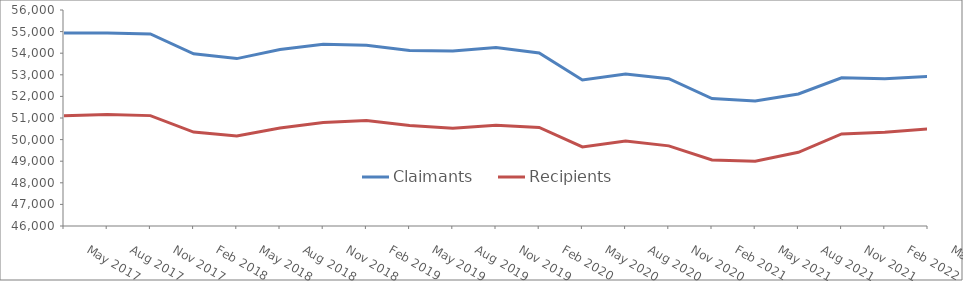
| Category | Claimants | Recipients |
|---|---|---|
| May 2017 | 54940 | 51100 |
| Aug 2017 | 54930 | 51160 |
| Nov 2017 | 54890 | 51110 |
| Feb 2018 | 53970 | 50350 |
| May 2018 | 53750 | 50170 |
| Aug 2018 | 54170 | 50540 |
| Nov 2018 | 54410 | 50790 |
| Feb 2019 | 54370 | 50880 |
| May 2019 | 54130 | 50650 |
| Aug 2019 | 54100 | 50520 |
| Nov 2019 | 54260 | 50660 |
| Feb 2020 | 54010 | 50560 |
| May 2020 | 52760 | 49660 |
| Aug 2020 | 53040 | 49940 |
| Nov 2020 | 52820 | 49710 |
| Feb 2021 | 51900 | 49060 |
| May 2021 | 51790 | 49000 |
| Aug 2021 | 52110 | 49410 |
| Nov 2021 | 52860 | 50260 |
| Feb 2022 | 52820 | 50340 |
| May 2022 | 52920 | 50500 |